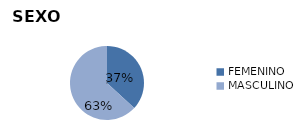
| Category | Series 0 |
|---|---|
| FEMENINO | 1008 |
| MASCULINO | 1728 |